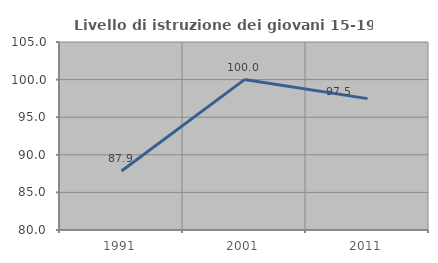
| Category | Livello di istruzione dei giovani 15-19 anni |
|---|---|
| 1991.0 | 87.85 |
| 2001.0 | 100 |
| 2011.0 | 97.468 |